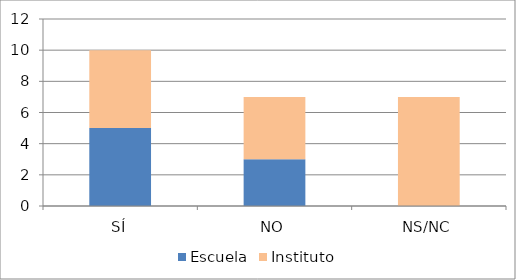
| Category | Escuela | Instituto |
|---|---|---|
| SÍ | 5 | 5 |
| NO | 3 | 4 |
| NS/NC | 0 | 7 |